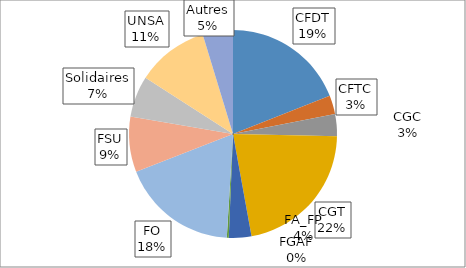
| Category | 3FP |
|---|---|
| CFDT | 19 |
| CFTC | 2.9 |
| CGC | 3.4 |
| CGT | 21.8 |
| FA_FP | 3.5 |
| FGAF | 0.3 |
| FO | 18.1 |
| FSU | 8.6 |
| Solidaires | 6.4 |
| UNSA | 11.2 |
| Autres | 4.7 |